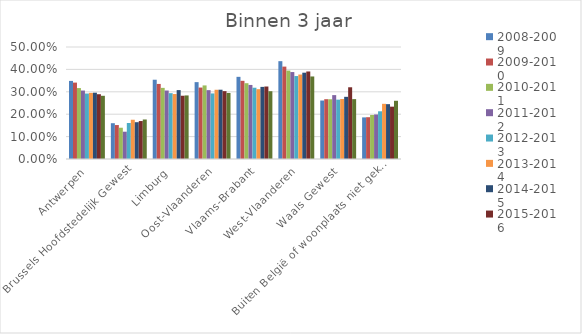
| Category | 2008-2009 | 2009-2010 | 2010-2011 | 2011-2012 | 2012-2013 | 2013-2014 | 2014-2015 | 2015-2016 | 2016-2017 |
|---|---|---|---|---|---|---|---|---|---|
| Antwerpen | 0.349 | 0.341 | 0.317 | 0.306 | 0.292 | 0.295 | 0.296 | 0.289 | 0.282 |
| Brussels Hoofdstedelijk Gewest | 0.16 | 0.152 | 0.14 | 0.122 | 0.161 | 0.175 | 0.164 | 0.169 | 0.176 |
| Limburg | 0.354 | 0.335 | 0.318 | 0.306 | 0.294 | 0.29 | 0.308 | 0.282 | 0.284 |
| Oost-Vlaanderen | 0.343 | 0.319 | 0.328 | 0.307 | 0.293 | 0.309 | 0.309 | 0.303 | 0.295 |
| Vlaams-Brabant | 0.367 | 0.349 | 0.338 | 0.331 | 0.318 | 0.312 | 0.322 | 0.324 | 0.303 |
| West-Vlaanderen | 0.437 | 0.412 | 0.395 | 0.388 | 0.37 | 0.377 | 0.385 | 0.391 | 0.368 |
| Waals Gewest | 0.261 | 0.267 | 0.267 | 0.285 | 0.265 | 0.268 | 0.278 | 0.32 | 0.267 |
| Buiten België of woonplaats niet gekend | 0.186 | 0.187 | 0.196 | 0.199 | 0.213 | 0.246 | 0.245 | 0.234 | 0.26 |